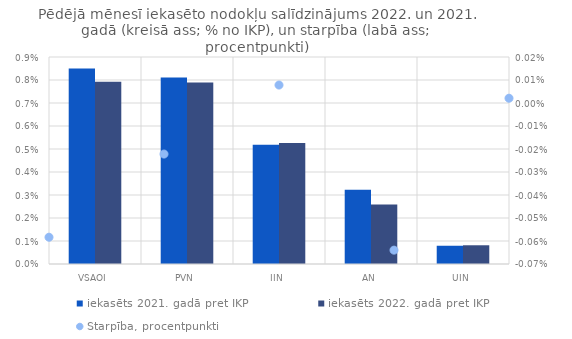
| Category | iekasēts 2021. gadā pret IKP | iekasēts 2022. gadā pret IKP |
|---|---|---|
| VSAOI | 0.009 | 0.008 |
| PVN | 0.008 | 0.008 |
| IIN | 0.005 | 0.005 |
| AN | 0.003 | 0.003 |
| UIN | 0.001 | 0.001 |